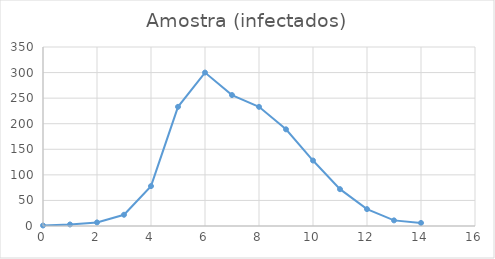
| Category | Amostra (infectados) |
|---|---|
| 0.0 | 1 |
| 1.0 | 3 |
| 2.0 | 7 |
| 3.0 | 22 |
| 4.0 | 78 |
| 5.0 | 233 |
| 6.0 | 300 |
| 7.0 | 256 |
| 8.0 | 233 |
| 9.0 | 189 |
| 10.0 | 128 |
| 11.0 | 72 |
| 12.0 | 33 |
| 13.0 | 11 |
| 14.0 | 6 |